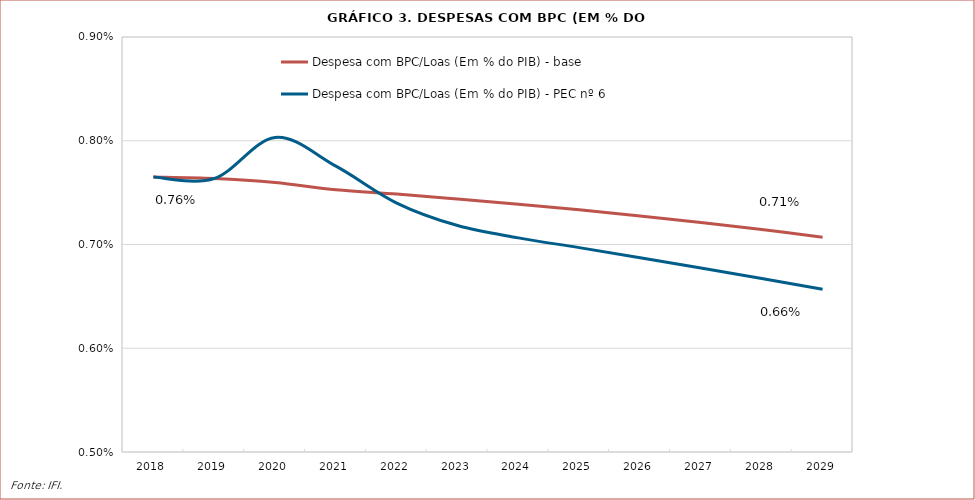
| Category | Despesa com BPC/Loas (Em % do PIB) - base | Despesa com BPC/Loas (Em % do PIB) - PEC nº 6 |
|---|---|---|
| 2018 | 0.008 | 0.008 |
| 2019 | 0.008 | 0.008 |
| 2020 | 0.008 | 0.008 |
| 2021 | 0.008 | 0.008 |
| 2022 | 0.007 | 0.007 |
| 2023 | 0.007 | 0.007 |
| 2024 | 0.007 | 0.007 |
| 2025 | 0.007 | 0.007 |
| 2026 | 0.007 | 0.007 |
| 2027 | 0.007 | 0.007 |
| 2028 | 0.007 | 0.007 |
| 2029 | 0.007 | 0.007 |